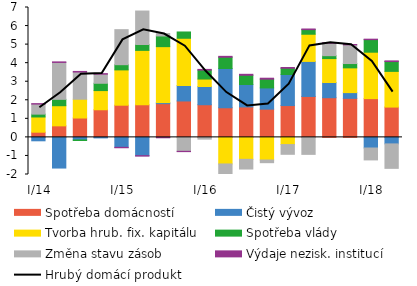
| Category | Spotřeba domácností  | Čistý vývoz  | Tvorba hrub. fix. kapitálu | Spotřeba vlády | Změna stavu zásob  | Výdaje nezisk. institucí |
|---|---|---|---|---|---|---|
|  I/14 | 0.28 | -0.184 | 0.82 | 0.152 | 0.542 | 0.024 |
| II | 0.622 | -1.652 | 1.085 | 0.343 | 1.99 | 0.029 |
| III | 1.044 | -0.138 | 1.013 | -0.031 | 1.465 | 0.032 |
| IV | 1.489 | -0.028 | 1.034 | 0.394 | 0.49 | 0.028 |
|  I/15 | 1.735 | -0.535 | 1.903 | 0.28 | 1.888 | -0.023 |
| II | 1.758 | -0.985 | 2.931 | 0.316 | 1.804 | -0.023 |
| III | 1.818 | 0.057 | 3.015 | 0.575 | 0.132 | -0.021 |
| IV | 1.963 | 0.833 | 2.547 | 0.339 | -0.752 | -0.016 |
|  I/16 | 1.76 | 0.983 | 0.401 | 0.482 | -0.094 | 0.038 |
| II | 1.597 | 2.114 | -1.433 | 0.609 | -0.552 | 0.048 |
| III | 1.642 | 1.21 | -1.182 | 0.497 | -0.522 | 0.051 |
| IV | 1.522 | 1.144 | -1.219 | 0.47 | -0.144 | 0.053 |
|  I/17 | 1.715 | 1.675 | -0.387 | 0.336 | -0.525 | 0.041 |
| II | 2.206 | 1.888 | 1.465 | 0.248 | -0.915 | 0.035 |
| III | 2.139 | 0.82 | 1.288 | 0.157 | 0.67 | 0.027 |
| IV | 2.104 | 0.31 | 1.333 | 0.233 | 1.008 | 0.018 |
|  I/18 | 2.09 | -0.572 | 2.502 | 0.678 | -0.642 | 0.024 |
| II | 1.634 | -0.351 | 1.923 | 0.53 | -1.318 | 0.036 |